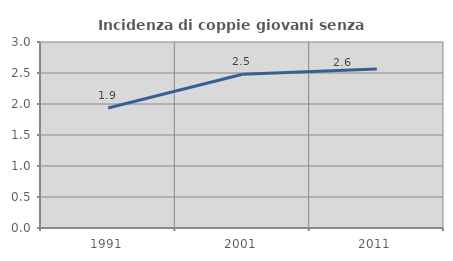
| Category | Incidenza di coppie giovani senza figli |
|---|---|
| 1991.0 | 1.935 |
| 2001.0 | 2.479 |
| 2011.0 | 2.564 |